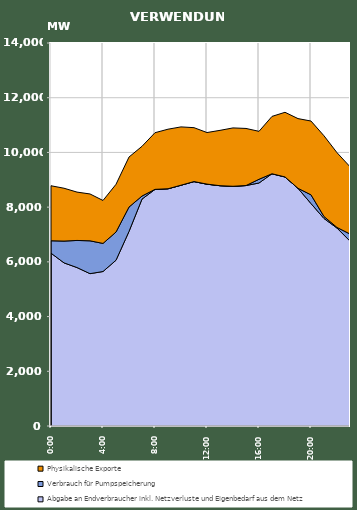
| Category | Abgabe an Endverbraucher inkl. Netzverluste und Eigenbedarf aus dem Netz | Verbrauch für Pumpspeicherung | Physikalische Exporte |
|---|---|---|---|
| 2007-01-17 | 6317.83 | 452.835 | 2011.212 |
| 2007-01-17 01:00:00 | 5963.212 | 796.193 | 1931.953 |
| 2007-01-17 02:00:00 | 5791.905 | 990.559 | 1767.43 |
| 2007-01-17 03:00:00 | 5568.147 | 1200.827 | 1713.009 |
| 2007-01-17 04:00:00 | 5646.938 | 1026.865 | 1569.773 |
| 2007-01-17 05:00:00 | 6058.959 | 1030.475 | 1745.109 |
| 2007-01-17 06:00:00 | 7111.438 | 891.972 | 1827.875 |
| 2007-01-17 07:00:00 | 8294.428 | 111.695 | 1817.958 |
| 2007-01-17 08:00:00 | 8648.904 | 1.332 | 2070.89 |
| 2007-01-17 09:00:00 | 8671.602 | 0.425 | 2177.307 |
| 2007-01-17 10:00:00 | 8801.047 | 1.321 | 2130.598 |
| 2007-01-17 11:00:00 | 8934.6 | 0.342 | 1970.103 |
| 2007-01-17 12:00:00 | 8837.477 | 4.129 | 1885.269 |
| 2007-01-17 13:00:00 | 8783.368 | 0.364 | 2023.013 |
| 2007-01-17 14:00:00 | 8761.3 | 1.335 | 2133.618 |
| 2007-01-17 15:00:00 | 8789.602 | 0.342 | 2086.862 |
| 2007-01-17 16:00:00 | 8883.059 | 135.532 | 1752.465 |
| 2007-01-17 17:00:00 | 9220.081 | 0.363 | 2096.381 |
| 2007-01-17 18:00:00 | 9103.234 | 1.371 | 2362.619 |
| 2007-01-17 19:00:00 | 8687.859 | 0.541 | 2547.86 |
| 2007-01-17 20:00:00 | 8130.026 | 319.561 | 2697.626 |
| 2007-01-17 21:00:00 | 7585.335 | 71.044 | 2951.113 |
| 2007-01-17 22:00:00 | 7235.303 | 22.803 | 2732.786 |
| 2007-01-17 23:00:00 | 6758.995 | 259.105 | 2459.126 |